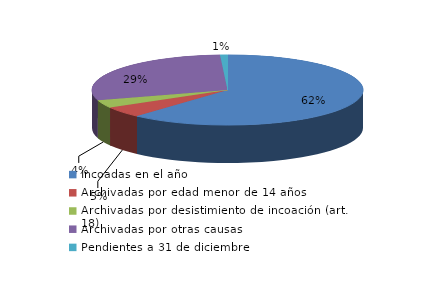
| Category | Series 0 |
|---|---|
| Incoadas en el año | 1120 |
| Archivadas por edad menor de 14 años | 91 |
| Archivadas por desistimiento de incoación (art. 18) | 66 |
| Archivadas por otras causas | 524 |
| Pendientes a 31 de diciembre | 16 |